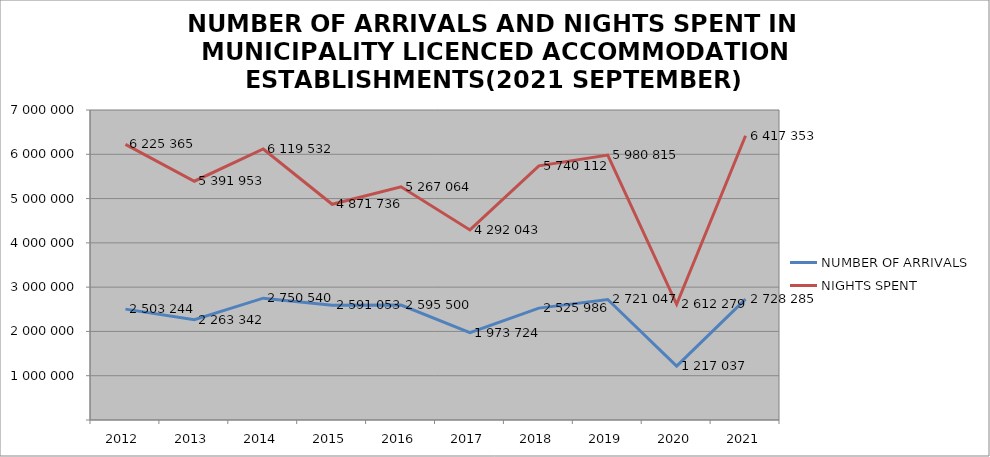
| Category | NUMBER OF ARRIVALS | NIGHTS SPENT |
|---|---|---|
| 2012 | 2503244 | 6225365 |
| 2013 | 2263342 | 5391953 |
| 2014 | 2750540 | 6119532 |
| 2015 | 2591053 | 4871736 |
| 2016 | 2595500 | 5267064 |
| 2017 | 1973724 | 4292043 |
| 2018 | 2525986 | 5740112 |
| 2019 | 2721047 | 5980815 |
| 2020 | 1217037 | 2612279 |
| 2021 | 2728285 | 6417353 |